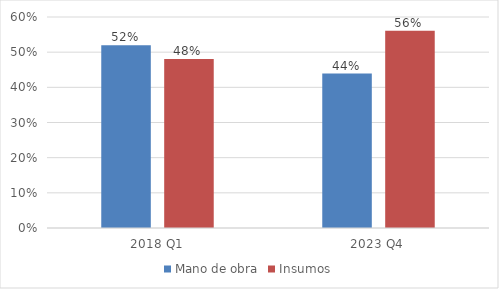
| Category | Mano de obra | Insumos |
|---|---|---|
| 2018 Q1 | 0.519 | 0.481 |
| 2023 Q4 | 0.439 | 0.561 |